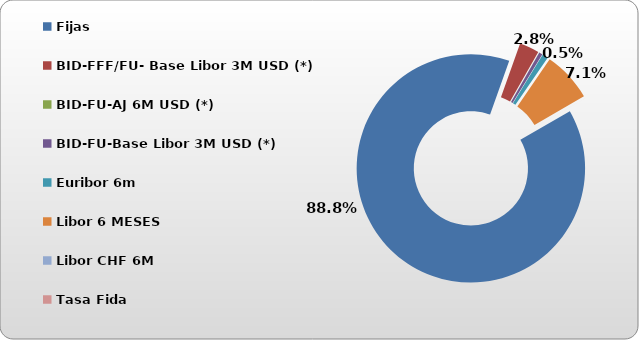
| Category | Series 0 |
|---|---|
| Fijas | 41570.001 |
| BID-FFF/FU- Base Libor 3M USD (*) | 1306.173 |
| BID-FU-AJ 6M USD (*) | 7.809 |
| BID-FU-Base Libor 3M USD (*) | 233.745 |
| Euribor 6m  | 383.062 |
| Libor 6 MESES | 3319.906 |
| Libor CHF 6M | 0 |
| Tasa Fida | 3.87 |